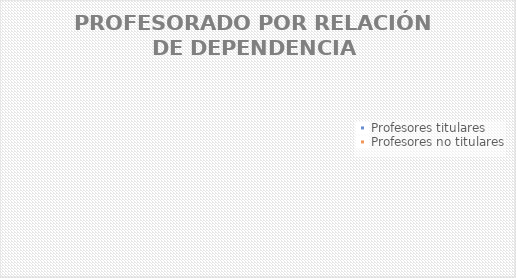
| Category | Series 0 |
|---|---|
| Profesores titulares | 0 |
| Profesores no titulares | 0 |